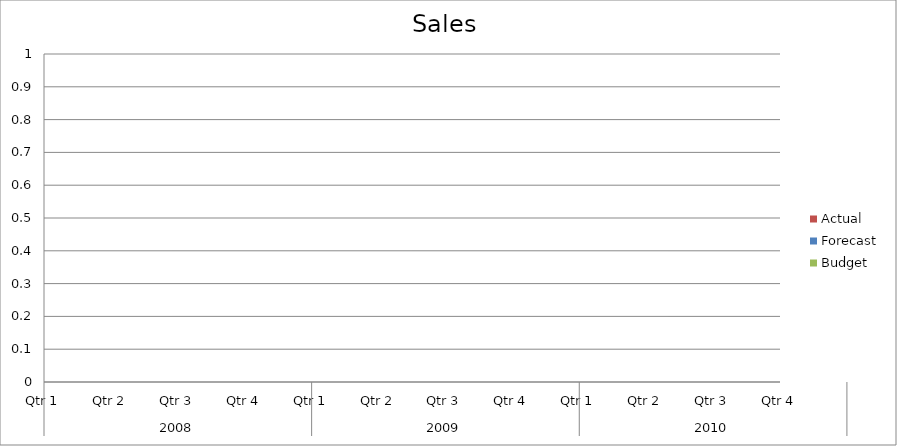
| Category | Budget | Forecast | Actual |
|---|---|---|---|
| 0 | 3240 | 3100 | 1830 |
| 1 | 1980 | 650 | 2770 |
| 2 | 2370 | 1870 | 2980 |
| 3 | 2390 | 3430 | 1900 |
| 4 | 1890 | 2270 | 1740 |
| 5 | 1120 | 1810 | 1830 |
| 6 | 3380 | 3380 | 1310 |
| 7 | 2200 | 2410 | 2450 |
| 8 | 1560 | 900 | 2180 |
| 9 | 550 | 1320 | 850 |
| 10 | 1820 | 3400 | 3350 |
| 11 | 780 | 2580 | 3280 |